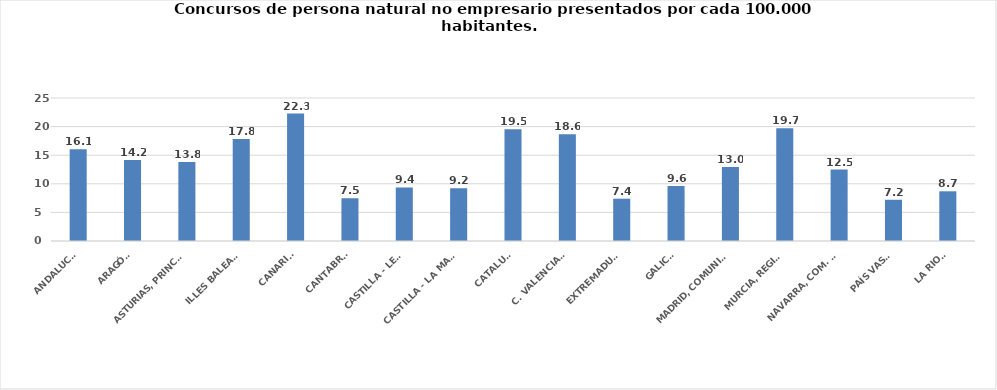
| Category | Series 0 |
|---|---|
| ANDALUCÍA | 16.055 |
| ARAGÓN | 14.155 |
| ASTURIAS, PRINCIPADO | 13.809 |
| ILLES BALEARS | 17.817 |
| CANARIAS | 22.278 |
| CANTABRIA | 7.476 |
| CASTILLA - LEÓN | 9.36 |
| CASTILLA - LA MANCHA | 9.228 |
| CATALUÑA | 19.534 |
| C. VALENCIANA | 18.646 |
| EXTREMADURA | 7.398 |
| GALICIA | 9.631 |
| MADRID, COMUNIDAD | 12.951 |
| MURCIA, REGIÓN | 19.708 |
| NAVARRA, COM. FORAL | 12.496 |
| PAÍS VASCO | 7.208 |
| LA RIOJA | 8.689 |